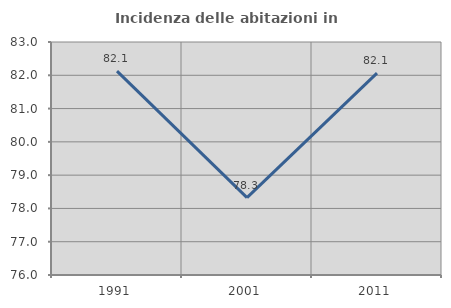
| Category | Incidenza delle abitazioni in proprietà  |
|---|---|
| 1991.0 | 82.123 |
| 2001.0 | 78.323 |
| 2011.0 | 82.063 |